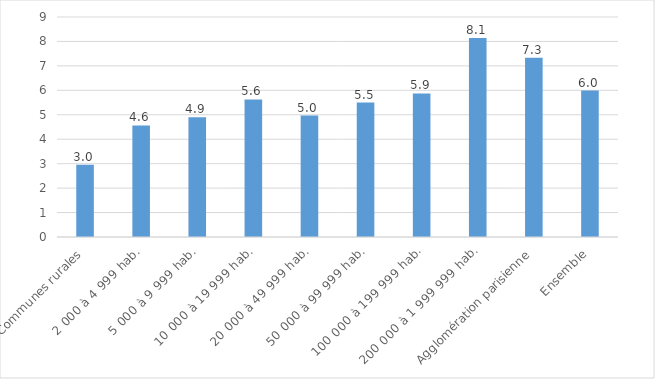
| Category | Actes "anti-LGBT" |
|---|---|
| Communes rurales | 2.952 |
| 2 000 à 4 999 hab. | 4.566 |
| 5 000 à 9 999 hab. | 4.903 |
| 10 000 à 19 999 hab. | 5.626 |
| 20 000 à 49 999 hab. | 4.968 |
| 50 000 à 99 999 hab. | 5.497 |
| 100 000 à 199 999 hab. | 5.874 |
| 200 000 à 1 999 999 hab. | 8.142 |
| Agglomération parisienne | 7.33 |
| Ensemble | 5.992 |